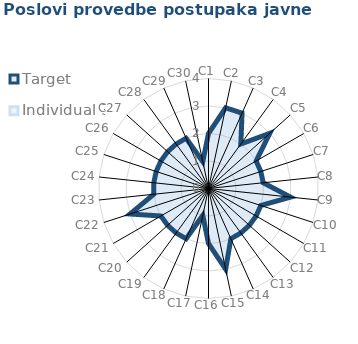
| Category | Target | Individual 3 |
|---|---|---|
| C1 | 2 | 0 |
| C2 | 3 | 0 |
| C3 | 3 | 0 |
| C4 | 2 | 0 |
| C5 | 3 | 0 |
| C6 | 2 | 0 |
| C7 | 2 | 0 |
| C8 | 2 | 0 |
| C9 | 3 | 0 |
| C10 | 2 | 0 |
| C11 | 2 | 0 |
| C12 | 2 | 0 |
| C13 | 2 | 0 |
| C14 | 2 | 0 |
| C15 | 3 | 0 |
| C16 | 2 | 0 |
| C17 | 1 | 0 |
| C18 | 2 | 0 |
| C19 | 2 | 0 |
| C20 | 2 | 0 |
| C21 | 2 | 0 |
| C22 | 3 | 0 |
| C23 | 2 | 0 |
| C24 | 2 | 0 |
| C25 | 2 | 0 |
| C26 | 2 | 0 |
| C27 | 2 | 0 |
| C28 | 2 | 0 |
| C29 | 2 | 0 |
| C30 | 1 | 0 |